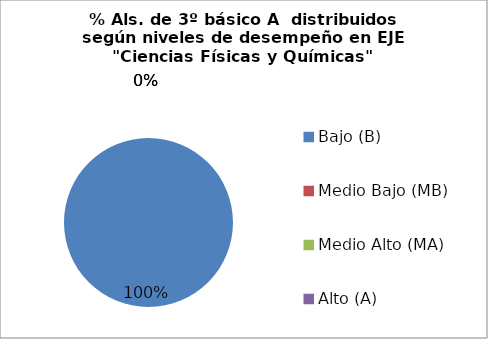
| Category | Series 0 |
|---|---|
| Bajo (B) | 1 |
| Medio Bajo (MB) | 0 |
| Medio Alto (MA) | 0 |
| Alto (A) | 0 |